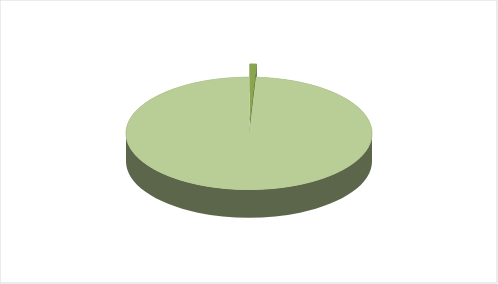
| Category | Series 0 |
|---|---|
| 0 | 0.009 |
| 1 | 0.991 |